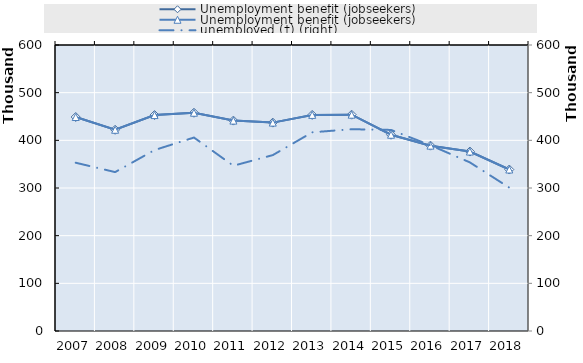
| Category | 0 | Series 14 | Series 15 | Series 16 | Series 17 | Series 18 | Series 19 | Unemployment benefit (jobseekers) |
|---|---|---|---|---|---|---|---|---|
| 2007.0 |  |  |  |  |  |  |  | 448942.837 |
| 2008.0 |  |  |  |  |  |  |  | 422161.083 |
| 2009.0 |  |  |  |  |  |  |  | 452987.08 |
| 2010.0 |  |  |  |  |  |  |  | 457896.753 |
| 2011.0 |  |  |  |  |  |  |  | 441388.91 |
| 2012.0 |  |  |  |  |  |  |  | 437172.75 |
| 2013.0 |  |  |  |  |  |  |  | 453346.08 |
| 2014.0 |  |  |  |  |  |  |  | 453815 |
| 2015.0 |  |  |  |  |  |  |  | 411745.34 |
| 2016.0 |  |  |  |  |  |  |  | 388834.25 |
| 2017.0 |  |  |  |  |  |  |  | 376449 |
| 2018.0 |  |  |  |  |  |  |  | 338777 |